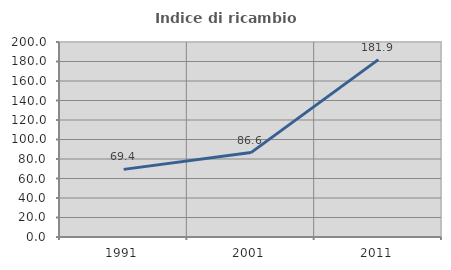
| Category | Indice di ricambio occupazionale  |
|---|---|
| 1991.0 | 69.362 |
| 2001.0 | 86.567 |
| 2011.0 | 181.944 |